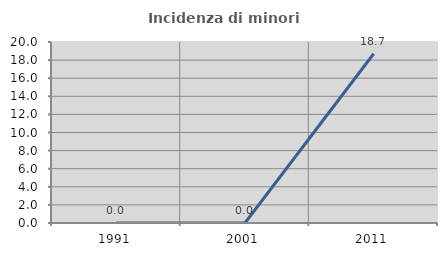
| Category | Incidenza di minori stranieri |
|---|---|
| 1991.0 | 0 |
| 2001.0 | 0 |
| 2011.0 | 18.699 |